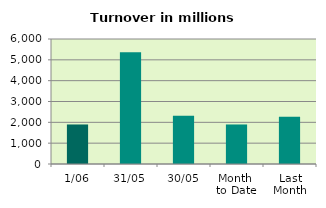
| Category | Series 0 |
|---|---|
| 1/06 | 1897.391 |
| 31/05 | 5368.24 |
| 30/05 | 2321.167 |
| Month 
to Date | 1897.391 |
| Last
Month | 2265.206 |